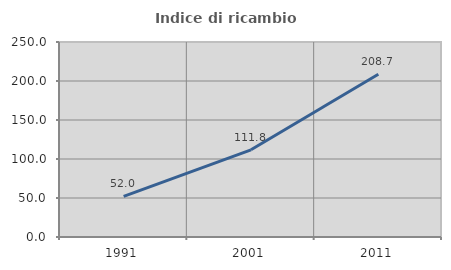
| Category | Indice di ricambio occupazionale  |
|---|---|
| 1991.0 | 52.041 |
| 2001.0 | 111.765 |
| 2011.0 | 208.696 |